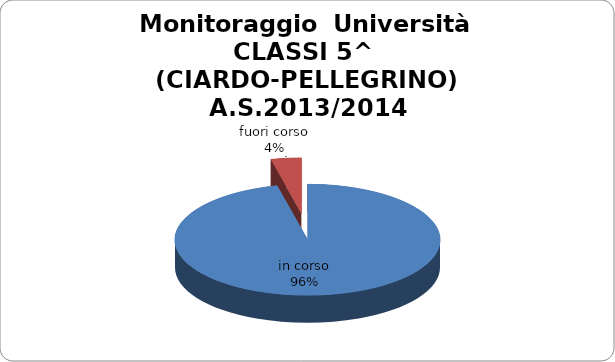
| Category | Series 0 | 96,30% 3,70% |
|---|---|---|
| in corso | 0.963 |  |
| fuori corso | 0.037 |  |